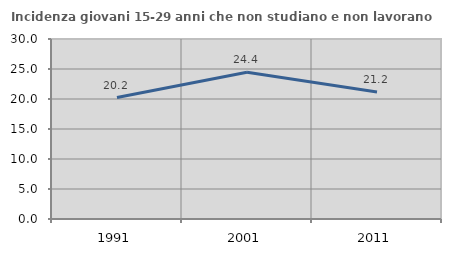
| Category | Incidenza giovani 15-29 anni che non studiano e non lavorano  |
|---|---|
| 1991.0 | 20.245 |
| 2001.0 | 24.444 |
| 2011.0 | 21.154 |